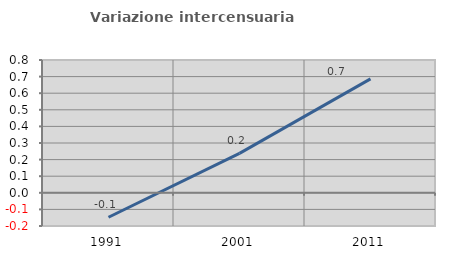
| Category | Variazione intercensuaria annua |
|---|---|
| 1991.0 | -0.147 |
| 2001.0 | 0.238 |
| 2011.0 | 0.686 |